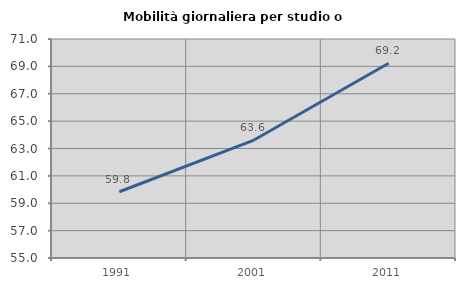
| Category | Mobilità giornaliera per studio o lavoro |
|---|---|
| 1991.0 | 59.838 |
| 2001.0 | 63.617 |
| 2011.0 | 69.223 |